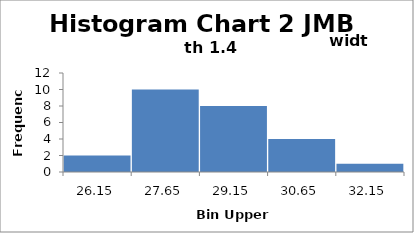
| Category | Series 0 |
|---|---|
| 26.15 | 2 |
| 27.65 | 10 |
| 29.15 | 8 |
| 30.65 | 4 |
| 32.15 | 1 |